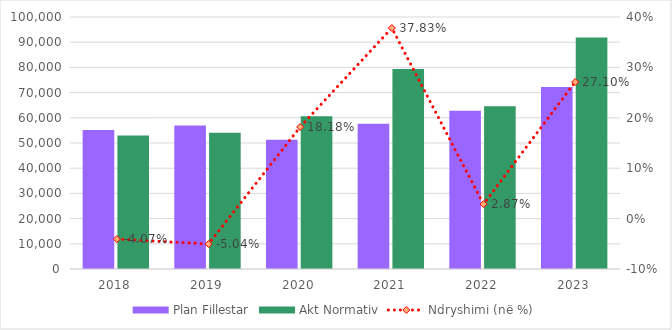
| Category | Plan Fillestar | Akt Normativ |
|---|---|---|
| 2018.0 | 55178 | 52934 |
| 2019.0 | 56908 | 54038 |
| 2020.0 | 51321 | 60653 |
| 2021.0 | 57604 | 79394 |
| 2022.0 | 62766 | 64565 |
| 2023.0 | 72248 | 91826 |